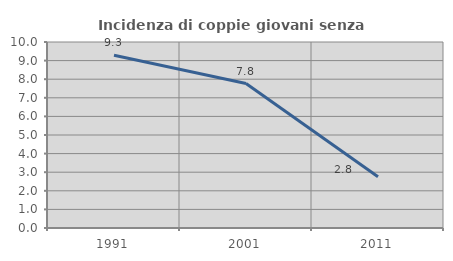
| Category | Incidenza di coppie giovani senza figli |
|---|---|
| 1991.0 | 9.283 |
| 2001.0 | 7.764 |
| 2011.0 | 2.761 |